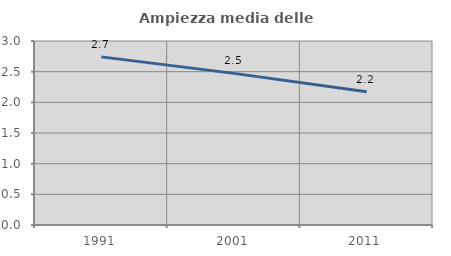
| Category | Ampiezza media delle famiglie |
|---|---|
| 1991.0 | 2.741 |
| 2001.0 | 2.472 |
| 2011.0 | 2.172 |